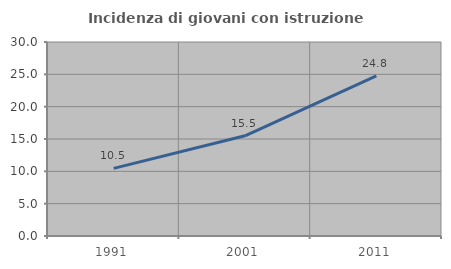
| Category | Incidenza di giovani con istruzione universitaria |
|---|---|
| 1991.0 | 10.46 |
| 2001.0 | 15.5 |
| 2011.0 | 24.76 |